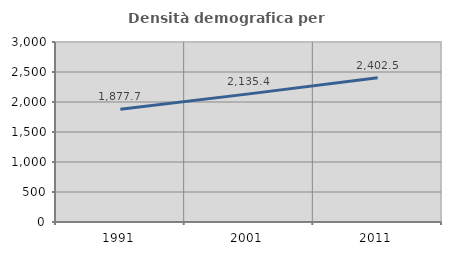
| Category | Densità demografica |
|---|---|
| 1991.0 | 1877.741 |
| 2001.0 | 2135.365 |
| 2011.0 | 2402.524 |